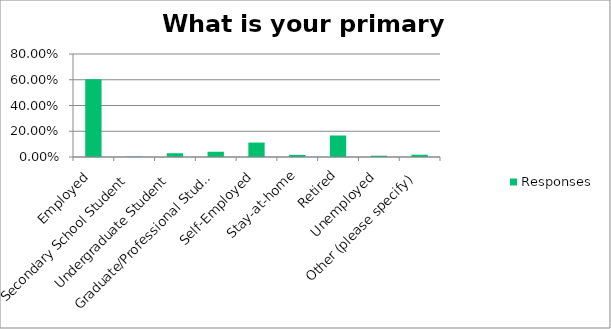
| Category | Responses |
|---|---|
| Employed | 0.603 |
| Secondary School Student | 0.003 |
| Undergraduate Student | 0.029 |
| Graduate/Professional Student | 0.041 |
| Self-Employed | 0.112 |
| Stay-at-home | 0.017 |
| Retired | 0.167 |
| Unemployed | 0.01 |
| Other (please specify) | 0.018 |